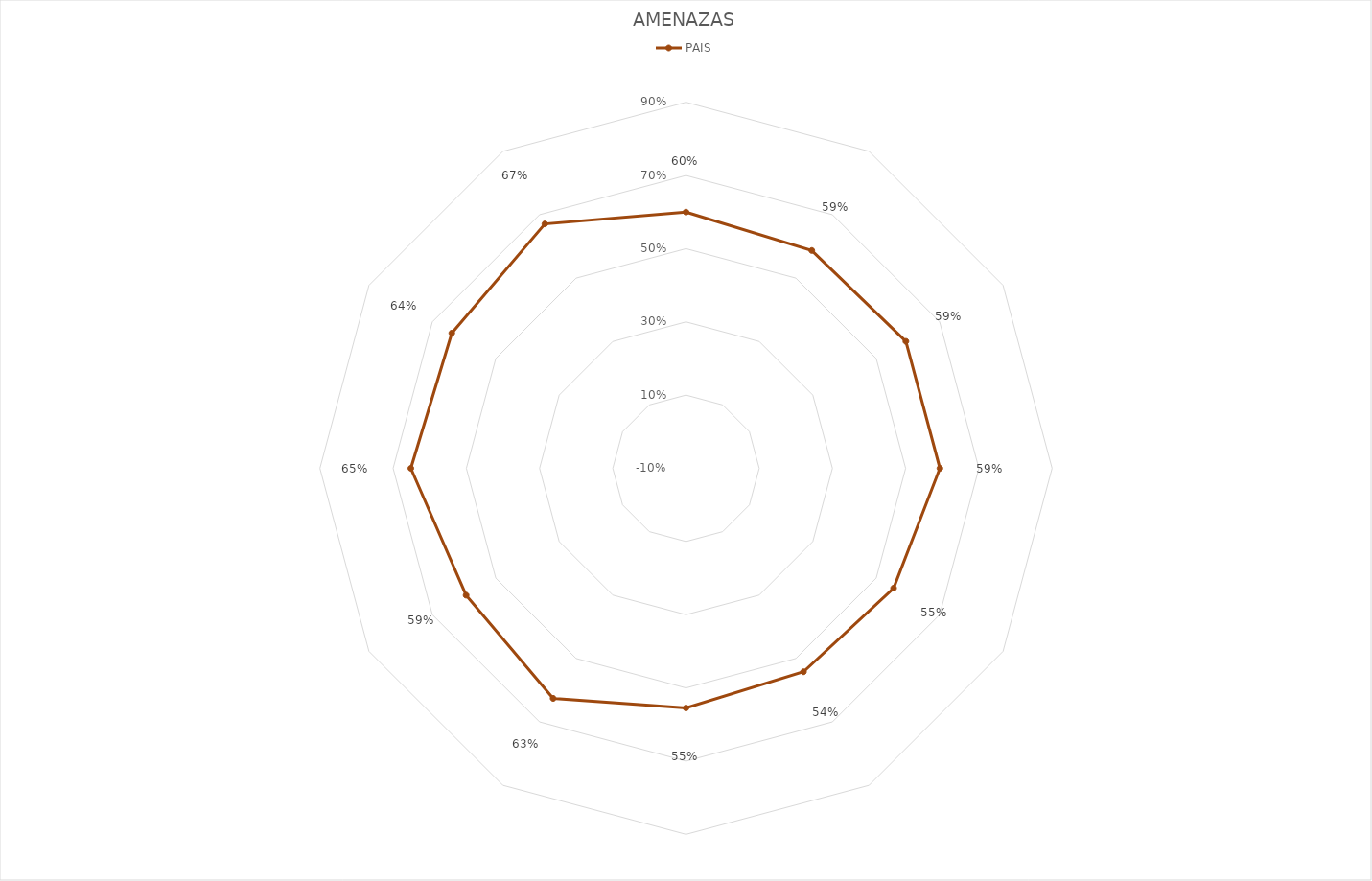
| Category | PAIS |
|---|---|
|  | 0.6 |
|  | 0.587 |
|  | 0.594 |
|  | 0.594 |
|  | 0.555 |
|  | 0.542 |
|  | 0.555 |
|  | 0.626 |
|  | 0.594 |
|  | 0.652 |
|  | 0.639 |
|  | 0.671 |